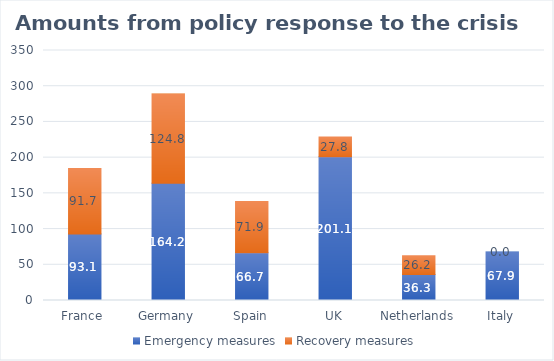
| Category | Emergency measures | Recovery measures |
|---|---|---|
| France  | 93.08 | 91.7 |
| Germany | 164.15 | 124.84 |
| Spain | 66.69 | 71.9 |
| UK | 201.135 | 27.83 |
| Netherlands | 36.295 | 26.2 |
| Italy | 67.9 | 0 |